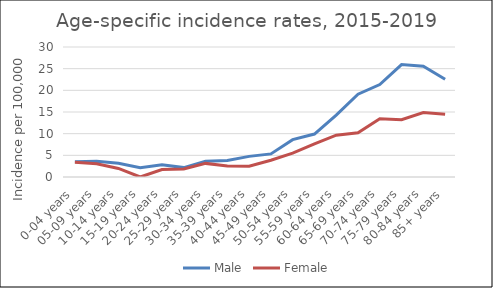
| Category | Male | Female |
|---|---|---|
| 0-04 years | 3.5 | 3.38 |
| 05-09 years | 3.63 | 3.04 |
| 10-14 years | 3.15 | 1.97 |
| 15-19 years | 2.13 | 0 |
| 20-24 years | 2.85 | 1.71 |
| 25-29 years | 2.17 | 1.86 |
| 30-34 years | 3.66 | 3.14 |
| 35-39 years | 3.79 | 2.53 |
| 40-44 years | 4.76 | 2.47 |
| 45-49 years | 5.33 | 3.87 |
| 50-54 years | 8.62 | 5.51 |
| 55-59 years | 9.92 | 7.65 |
| 60-64 years | 14.29 | 9.66 |
| 65-69 years | 19.12 | 10.2 |
| 70-74 years | 21.34 | 13.44 |
| 75-79 years | 25.94 | 13.23 |
| 80-84 years | 25.56 | 14.88 |
| 85+ years | 22.54 | 14.46 |